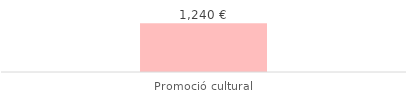
| Category | Total |
|---|---|
| Promoció cultural | 1240 |